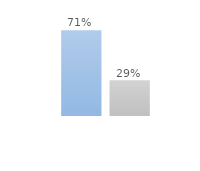
| Category | Series 0 | Series 2 |
|---|---|---|
| 0 | 0.708 | 0.292 |